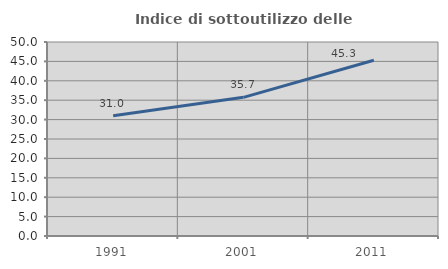
| Category | Indice di sottoutilizzo delle abitazioni  |
|---|---|
| 1991.0 | 30.996 |
| 2001.0 | 35.739 |
| 2011.0 | 45.294 |